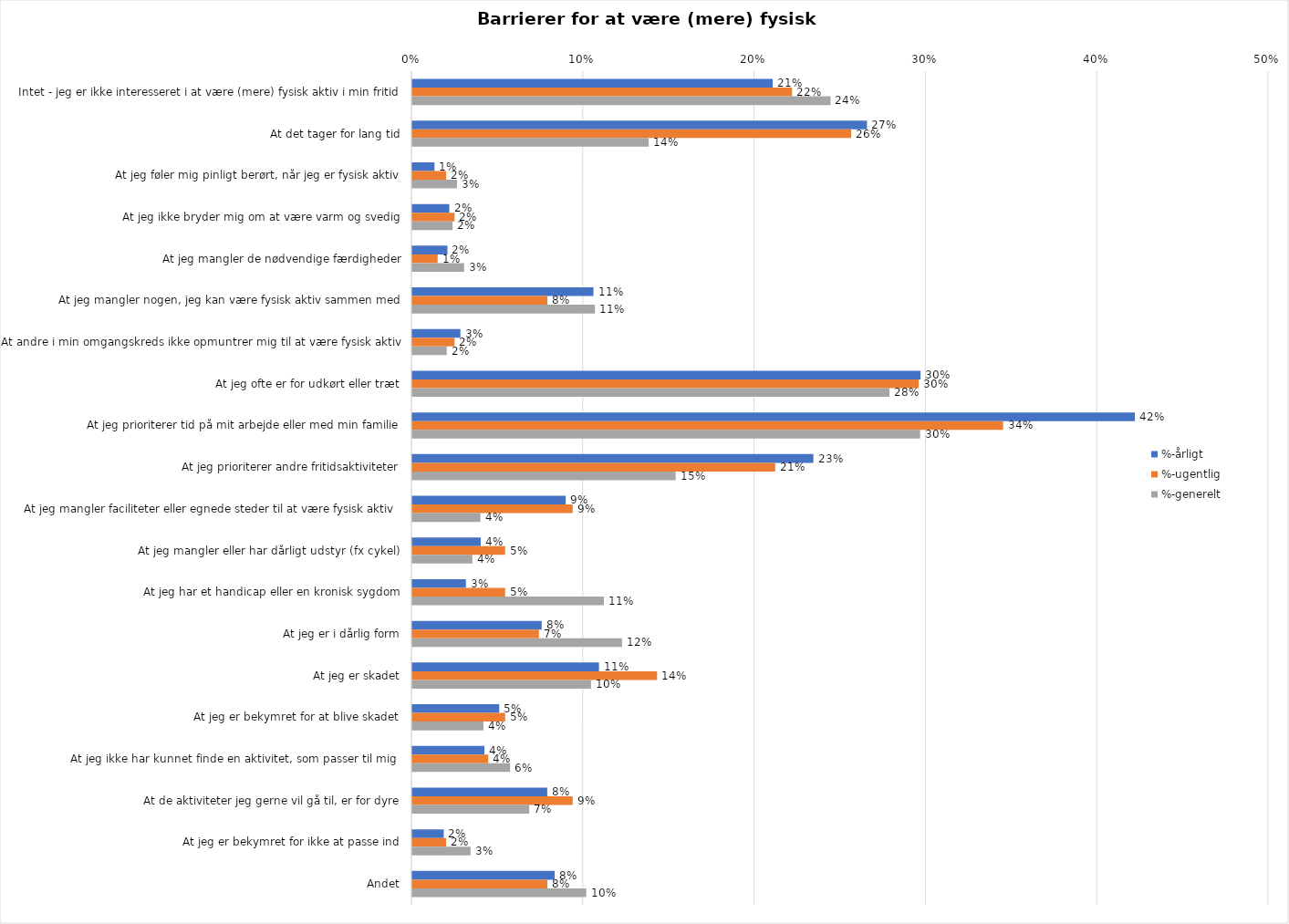
| Category | %-årligt | %-ugentlig | %-generelt |
|---|---|---|---|
| Intet - jeg er ikke interesseret i at være (mere) fysisk aktiv i min fritid | 0.21 | 0.222 | 0.244 |
| At det tager for lang tid | 0.265 | 0.256 | 0.138 |
| At jeg føler mig pinligt berørt, når jeg er fysisk aktiv | 0.013 | 0.02 | 0.026 |
| At jeg ikke bryder mig om at være varm og svedig | 0.022 | 0.025 | 0.023 |
| At jeg mangler de nødvendige færdigheder | 0.02 | 0.015 | 0.03 |
| At jeg mangler nogen, jeg kan være fysisk aktiv sammen med | 0.106 | 0.079 | 0.107 |
| At andre i min omgangskreds ikke opmuntrer mig til at være fysisk aktiv | 0.028 | 0.025 | 0.02 |
| At jeg ofte er for udkørt eller træt | 0.297 | 0.296 | 0.279 |
| At jeg prioriterer tid på mit arbejde eller med min familie | 0.422 | 0.345 | 0.296 |
| At jeg prioriterer andre fritidsaktiviteter | 0.234 | 0.212 | 0.154 |
| At jeg mangler faciliteter eller egnede steder til at være fysisk aktiv  | 0.09 | 0.094 | 0.04 |
| At jeg mangler eller har dårligt udstyr (fx cykel) | 0.04 | 0.054 | 0.035 |
| At jeg har et handicap eller en kronisk sygdom | 0.031 | 0.054 | 0.112 |
| At jeg er i dårlig form | 0.076 | 0.074 | 0.122 |
| At jeg er skadet | 0.109 | 0.143 | 0.104 |
| At jeg er bekymret for at blive skadet | 0.051 | 0.054 | 0.041 |
| At jeg ikke har kunnet finde en aktivitet, som passer til mig  | 0.042 | 0.044 | 0.057 |
| At de aktiviteter jeg gerne vil gå til, er for dyre | 0.079 | 0.094 | 0.068 |
| At jeg er bekymret for ikke at passe ind | 0.018 | 0.02 | 0.034 |
| Andet | 0.083 | 0.079 | 0.102 |